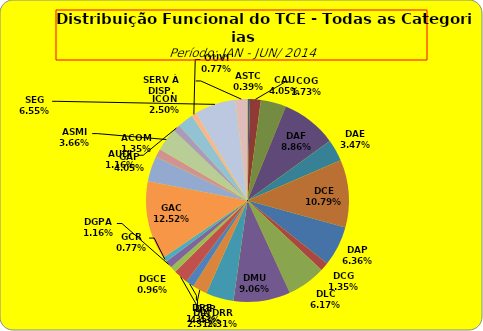
| Category | ASTC COG CAU DAF DAE DCE DAP DCG DLC DMU DGP DIN DPE DRR DGCE DGPA GCR GAC GAP ACOM ASMI AUDI ICON OUVI SEG SERV À DISP. |
|---|---|
| ASTC | 2 |
| COG | 9 |
| CAU | 21 |
| DAF | 46 |
| DAE | 18 |
| DCE | 56 |
| DAP | 33 |
| DCG | 7 |
| DLC | 32 |
| DMU | 47 |
| DGP | 23 |
| DIN | 12 |
| DPE | 7 |
| DRR | 12 |
| DGCE | 5 |
| DGPA | 6 |
| GCR | 4 |
| GAC | 65 |
| GAP | 21 |
| ACOM | 7 |
| ASMI | 19 |
| AUDI | 6 |
| ICON | 13 |
| OUVI | 4 |
| SEG | 34 |
| SERV À DISP. | 10 |